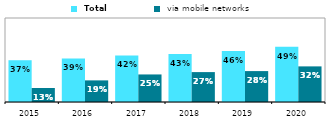
| Category |  Total |  via mobile networks |
|---|---|---|
| 2015 | 0.373 | 0.125 |
| 2016 | 0.389 | 0.193 |
| 2017 | 0.416 | 0.246 |
| 2018 | 0.429 | 0.267 |
| 2019 | 0.456 | 0.276 |
| 2020 | 0.494 | 0.318 |